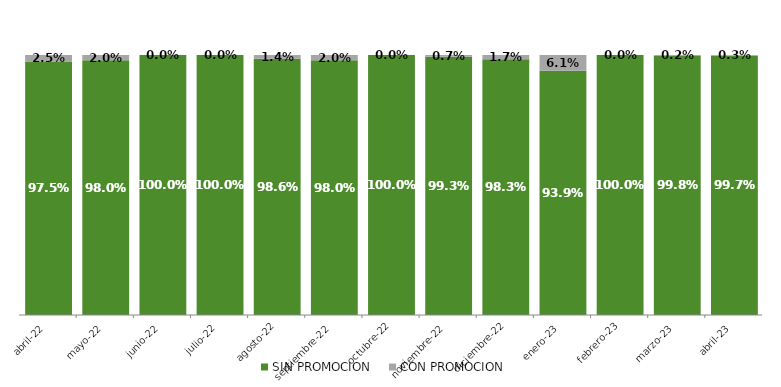
| Category | SIN PROMOCION   | CON PROMOCION   |
|---|---|---|
| 2022-04-01 | 0.975 | 0.025 |
| 2022-05-01 | 0.98 | 0.02 |
| 2022-06-01 | 1 | 0 |
| 2022-07-01 | 1 | 0 |
| 2022-08-01 | 0.986 | 0.014 |
| 2022-09-01 | 0.98 | 0.02 |
| 2022-10-01 | 1 | 0 |
| 2022-11-01 | 0.993 | 0.007 |
| 2022-12-01 | 0.983 | 0.017 |
| 2023-01-01 | 0.939 | 0.061 |
| 2023-02-01 | 1 | 0 |
| 2023-03-01 | 0.998 | 0.002 |
| 2023-04-01 | 0.997 | 0.003 |